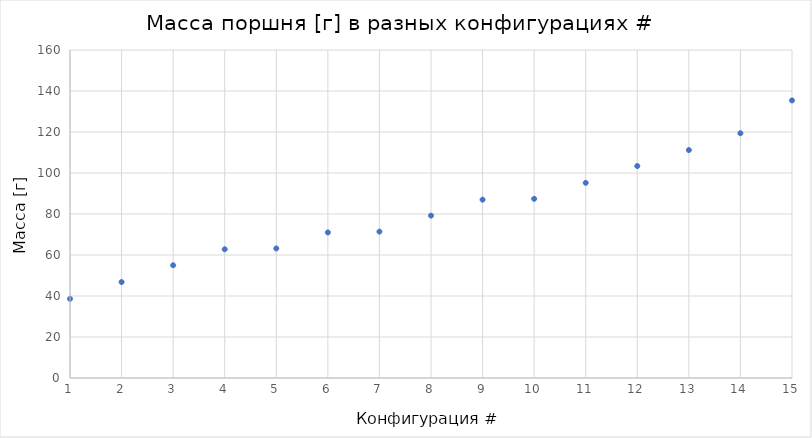
| Category | Масса [г] |
|---|---|
| 1.0 | 38.6 |
| 2.0 | 46.8 |
| 3.0 | 55 |
| 4.0 | 62.8 |
| 5.0 | 63.2 |
| 6.0 | 71 |
| 7.0 | 71.4 |
| 8.0 | 79.2 |
| 9.0 | 87 |
| 10.0 | 87.4 |
| 11.0 | 95.2 |
| 12.0 | 103.4 |
| 13.0 | 111.2 |
| 14.0 | 119.4 |
| 15.0 | 135.4 |